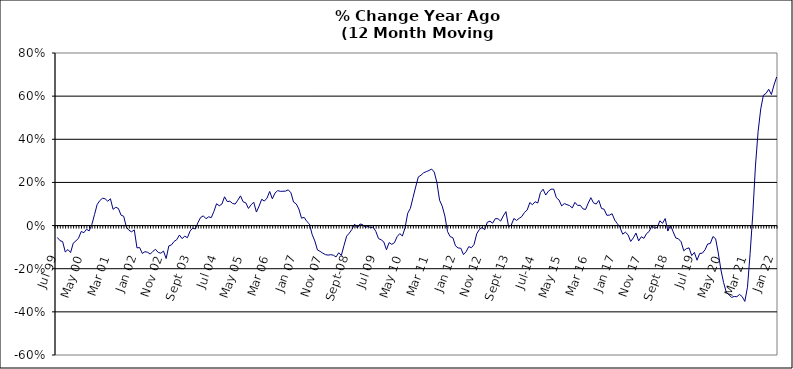
| Category | Series 0 |
|---|---|
| Jul 99 | -0.055 |
| Aug 99 | -0.07 |
| Sep 99 | -0.074 |
| Oct 99 | -0.123 |
| Nov 99 | -0.111 |
| Dec 99 | -0.125 |
| Jan 00 | -0.082 |
| Feb 00 | -0.071 |
| Mar 00 | -0.058 |
| Apr 00 | -0.027 |
| May 00 | -0.033 |
| Jun 00 | -0.017 |
| Jul 00 | -0.025 |
| Aug 00 | 0.005 |
| Sep 00 | 0.05 |
| Oct 00 | 0.098 |
| Nov 00 | 0.116 |
| Dec 00 | 0.127 |
| Jan 01 | 0.124 |
| Feb 01 | 0.113 |
| Mar 01 | 0.124 |
| Apr 01 | 0.075 |
| May 01 | 0.085 |
| Jun 01 | 0.08 |
| Jul 01 | 0.048 |
| Aug 01 | 0.043 |
| Sep 01 | -0.007 |
| Oct 01 | -0.022 |
| Nov 01 | -0.029 |
| Dec 01 | -0.02 |
| Jan 02 | -0.103 |
| Feb 02 | -0.102 |
| Mar 02 | -0.129 |
| Apr 02 | -0.121 |
| May 02 | -0.124 |
| Jun 02 | -0.132 |
| Jul 02 | -0.119 |
| Aug 02 | -0.11 |
| Sep 02 | -0.125 |
| Oct 02 | -0.128 |
| Nov 02 | -0.118 |
| Dec 02 | -0.153 |
| Jan 03 | -0.094 |
| Feb 03 | -0.09 |
| Mar 03 | -0.073 |
| Apr 03 | -0.065 |
| May 03 | -0.044 |
| Jun 03 | -0.06 |
| Jul 03 | -0.049 |
| Aug 03 | -0.056 |
| Sep 03 | -0.026 |
| Oct 03 | -0.012 |
| Nov 03 | -0.016 |
| Dec 03 | 0.014 |
| Jan 04 | 0.038 |
| Feb 04 | 0.045 |
| Mar 04 | 0.032 |
| Apr 04 | 0.041 |
| May 04 | 0.037 |
| Jun 04 | 0.066 |
| Jul 04 | 0.101 |
| Aug 04 | 0.092 |
| Sep 04 | 0.1 |
| Oct 04 | 0.133 |
| Nov 04 | 0.111 |
| Dec 04 | 0.113 |
| Jan 05 | 0.103 |
| Feb 05 | 0.1 |
| Mar 05 | 0.118 |
| Apr 05 | 0.138 |
| May 05 | 0.11 |
| Jun 05 | 0.106 |
| Jul 05 | 0.079 |
| Aug 05 | 0.097 |
| Sep 05 | 0.108 |
| Oct 05 | 0.063 |
| Nov 05 | 0.09 |
| Dec 05 | 0.122 |
| Jan 06 | 0.114 |
| Feb 06 | 0.127 |
| Mar 06 | 0.158 |
| Apr 06 | 0.124 |
| May 06 | 0.151 |
| Jun 06 | 0.162 |
| Jul 06 | 0.159 |
| Aug 06 | 0.159 |
| Sep 06 | 0.16 |
| Oct 06 | 0.166 |
| Nov 06 | 0.152 |
| Dec 06 | 0.109 |
| Jan 07 | 0.101 |
| Feb 07 | 0.076 |
| Mar 07 | 0.034 |
| Apr 07 | 0.038 |
| May 07 | 0.019 |
| Jun 07 | 0.007 |
| Jul 07 | -0.041 |
| Aug 07 | -0.071 |
| Sep 07 | -0.113 |
| Oct 07 | -0.12 |
| Nov 07 | -0.128 |
| Dec 07 | -0.135 |
| Jan 08 | -0.137 |
| Feb 08 | -0.135 |
| Mar 08 | -0.137 |
| Apr 08 | -0.145 |
| May 08 | -0.126 |
| Jun 08 | -0.138 |
| Jul 08 | -0.093 |
| Aug 08 | -0.049 |
| Sep-08 | -0.035 |
| Oct 08 | -0.018 |
| Nov 08 | 0.007 |
| Dec 08 | -0.011 |
| Jan 09 | 0.007 |
| Feb 09 | 0.005 |
| Mar 09 | -0.009 |
| Apr 09 | -0.003 |
| May 09 | -0.01 |
| Jun 09 | -0.007 |
| Jul 09 | -0.027 |
| Aug 09 | -0.06 |
| Sep 09 | -0.066 |
| Oct 09 | -0.076 |
| Nov 09 | -0.112 |
| Dec 09 | -0.079 |
| Jan 10 | -0.087 |
| Feb 10 | -0.079 |
| Mar 10 | -0.052 |
| Apr 10 | -0.037 |
| May 10 | -0.048 |
| Jun 10 | -0.01 |
| Jul 10 | 0.057 |
| Aug 10 | 0.08 |
| Sep 10 | 0.13 |
| Oct 10 | 0.179 |
| Nov 10 | 0.226 |
| Dec 10 | 0.233 |
| Jan 11 | 0.245 |
| Feb 11 | 0.25 |
| Mar 11 | 0.255 |
| Apr 11 | 0.262 |
| May 11 | 0.248 |
| Jun 11 | 0.199 |
| Jul 11 | 0.118 |
| Aug 11 | 0.09 |
| Sep 11 | 0.044 |
| Oct 11 | -0.028 |
| Nov 11 | -0.051 |
| Dec 11 | -0.056 |
| Jan 12 | -0.094 |
| Feb 12 | -0.104 |
| Mar 12 | -0.105 |
| Apr 12 | -0.134 |
| May 12 | -0.121 |
| Jun 12 | -0.098 |
| Jul 12 | -0.103 |
| Aug 12 | -0.087 |
| Sep 12 | -0.038 |
| Oct 12 | -0.018 |
| Nov 12 | -0.009 |
| Dec 12 | -0.019 |
| Jan 13 | 0.016 |
| Feb-13 | 0.02 |
| Mar-13 | 0.011 |
| Apr 13 | 0.032 |
| May 13 | 0.032 |
| Jun-13 | 0.021 |
| Jul 13 | 0.045 |
| Aug 13 | 0.065 |
| Sep 13 | -0.005 |
| Oct 13 | 0.002 |
| Nov 13 | 0.033 |
| Dec 13 | 0.024 |
| Jan 14 | 0.034 |
| Feb-14 | 0.042 |
| Mar 14 | 0.061 |
| Apr 14 | 0.072 |
| May 14 | 0.107 |
| Jun 14 | 0.097 |
| Jul-14 | 0.111 |
| Aug-14 | 0.105 |
| Sep 14 | 0.153 |
| Oct 14 | 0.169 |
| Nov 14 | 0.141 |
| Dec 14 | 0.159 |
| Jan 15 | 0.169 |
| Feb 15 | 0.169 |
| Mar 15 | 0.129 |
| Apr-15 | 0.118 |
| May 15 | 0.091 |
| Jun-15 | 0.102 |
| Jul 15 | 0.097 |
| Aug 15 | 0.092 |
| Sep 15 | 0.082 |
| Oct 15 | 0.108 |
| Nov 15 | 0.093 |
| Dec 15 | 0.094 |
| Jan 16 | 0.078 |
| Feb 16 | 0.075 |
| Mar 16 | 0.104 |
| Apr 16 | 0.129 |
| May 16 | 0.105 |
| Jun 16 | 0.1 |
| Jul 16 | 0.117 |
| Aug 16 | 0.08 |
| Sep 16 | 0.076 |
| Oct 16 | 0.048 |
| Nov 16 | 0.048 |
| Dec 16 | 0.055 |
| Jan 17 | 0.025 |
| Feb 17 | 0.009 |
| Mar 17 | -0.01 |
| Apr 17 | -0.04 |
| May 17 | -0.031 |
| Jun 17 | -0.042 |
| Jul 17 | -0.074 |
| Aug 17 | -0.057 |
| Sep 17 | -0.035 |
| Oct 17 | -0.071 |
| Nov 17 | -0.052 |
| Dec 17 | -0.059 |
| Jan 18 | -0.037 |
| Feb 18 | -0.027 |
| Mar 18 | 0 |
| Apr 18 | -0.012 |
| May 18 | -0.009 |
| Jun 18 | 0.022 |
| Jul 18 | 0.01 |
| Aug 18 | 0.033 |
| Sep 18 | -0.025 |
| Oct 18 | 0.002 |
| Nov 18 | -0.029 |
| Dec 18 | -0.058 |
| Jan 19 | -0.061 |
| Feb 19 | -0.075 |
| Mar 19 | -0.117 |
| Apr 19 | -0.107 |
| May 19 | -0.104 |
| Jun 19 | -0.139 |
| Jul 19 | -0.124 |
| Aug 19 | -0.16 |
| Sep 19 | -0.129 |
| Oct 19 | -0.128 |
| Nov 19 | -0.112 |
| Dec 19 | -0.085 |
| Jan 20 | -0.083 |
| Feb 20 | -0.051 |
| Mar 20 | -0.061 |
| Apr 20 | -0.127 |
| May 20 | -0.206 |
| Jun 20 | -0.264 |
| Jul 20 | -0.308 |
| Aug 20 | -0.32 |
| Sep 20 | -0.333 |
| Oct 20 | -0.329 |
| Nov 20 | -0.33 |
| Dec 20 | -0.319 |
| Jan 21 | -0.329 |
| Feb 21 | -0.352 |
| Mar 21 | -0.286 |
| Apr 21 | -0.129 |
| May 21 | 0.053 |
| Jun 21 | 0.276 |
| Jul 21 | 0.435 |
| Aug 21 | 0.541 |
| Sep 21 | 0.604 |
| Oct 21 | 0.613 |
| Nov 21 | 0.632 |
| Dec 21 | 0.608 |
| Jan 22 | 0.652 |
| Feb 22 | 0.689 |